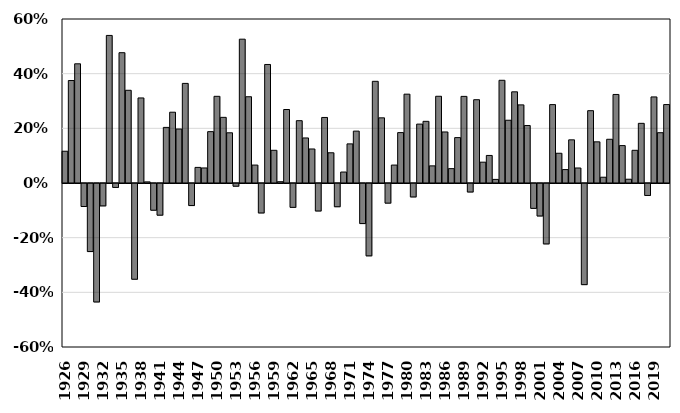
| Category | Series 1 |
|---|---|
| 1926.0 | 0.116 |
| 1927.0 | 0.375 |
| 1928.0 | 0.436 |
| 1929.0 | -0.084 |
| 1930.0 | -0.249 |
| 1931.0 | -0.433 |
| 1932.0 | -0.082 |
| 1933.0 | 0.54 |
| 1934.0 | -0.014 |
| 1935.0 | 0.477 |
| 1936.0 | 0.339 |
| 1937.0 | -0.35 |
| 1938.0 | 0.311 |
| 1939.0 | 0.004 |
| 1940.0 | -0.098 |
| 1941.0 | -0.116 |
| 1942.0 | 0.203 |
| 1943.0 | 0.259 |
| 1944.0 | 0.198 |
| 1945.0 | 0.364 |
| 1946.0 | -0.081 |
| 1947.0 | 0.057 |
| 1948.0 | 0.055 |
| 1949.0 | 0.188 |
| 1950.0 | 0.317 |
| 1951.0 | 0.24 |
| 1952.0 | 0.184 |
| 1953.0 | -0.01 |
| 1954.0 | 0.526 |
| 1955.0 | 0.316 |
| 1956.0 | 0.066 |
| 1957.0 | -0.108 |
| 1958.0 | 0.434 |
| 1959.0 | 0.12 |
| 1960.0 | 0.005 |
| 1961.0 | 0.269 |
| 1962.0 | -0.087 |
| 1963.0 | 0.228 |
| 1964.0 | 0.165 |
| 1965.0 | 0.124 |
| 1966.0 | -0.101 |
| 1967.0 | 0.24 |
| 1968.0 | 0.111 |
| 1969.0 | -0.085 |
| 1970.0 | 0.04 |
| 1971.0 | 0.143 |
| 1972.0 | 0.19 |
| 1973.0 | -0.147 |
| 1974.0 | -0.265 |
| 1975.0 | 0.372 |
| 1976.0 | 0.238 |
| 1977.0 | -0.072 |
| 1978.0 | 0.066 |
| 1979.0 | 0.184 |
| 1980.0 | 0.325 |
| 1981.0 | -0.049 |
| 1982.0 | 0.216 |
| 1983.0 | 0.226 |
| 1984.0 | 0.063 |
| 1985.0 | 0.317 |
| 1986.0 | 0.187 |
| 1987.0 | 0.052 |
| 1988.0 | 0.166 |
| 1989.0 | 0.317 |
| 1990.0 | -0.031 |
| 1991.0 | 0.305 |
| 1992.0 | 0.076 |
| 1993.0 | 0.101 |
| 1994.0 | 0.013 |
| 1995.0 | 0.376 |
| 1996.0 | 0.23 |
| 1997.0 | 0.334 |
| 1998.0 | 0.286 |
| 1999.0 | 0.21 |
| 2000.0 | -0.091 |
| 2001.0 | -0.119 |
| 2002.0 | -0.221 |
| 2003.0 | 0.287 |
| 2004.0 | 0.109 |
| 2005.0 | 0.049 |
| 2006.0 | 0.158 |
| 2007.0 | 0.055 |
| 2008.0 | -0.37 |
| 2009.0 | 0.265 |
| 2010.0 | 0.151 |
| 2011.0 | 0.021 |
| 2012.0 | 0.16 |
| 2013.0 | 0.324 |
| 2014.0 | 0.137 |
| 2015.0 | 0.014 |
| 2016.0 | 0.12 |
| 2017.0 | 0.218 |
| 2018.0 | -0.044 |
| 2019.0 | 0.315 |
| 2020.0 | 0.184 |
| 2021.0 | 0.287 |